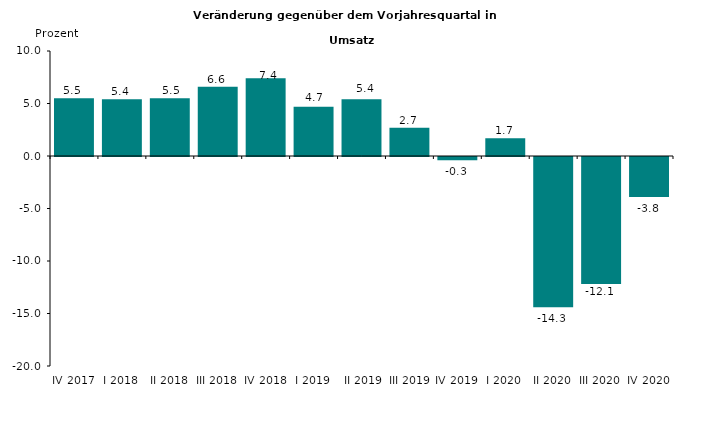
| Category | Series 0 |
|---|---|
| IV 2017 | 5.5 |
| I 2018 | 5.4 |
| II 2018 | 5.5 |
| III 2018 | 6.6 |
| IV 2018 | 7.4 |
| I 2019 | 4.7 |
|  II 2019 | 5.4 |
|  III 2019 | 2.7 |
| IV 2019 | -0.3 |
| I 2020 | 1.7 |
| II 2020 | -14.3 |
| III 2020 | -12.1 |
| IV 2020 | -3.8 |